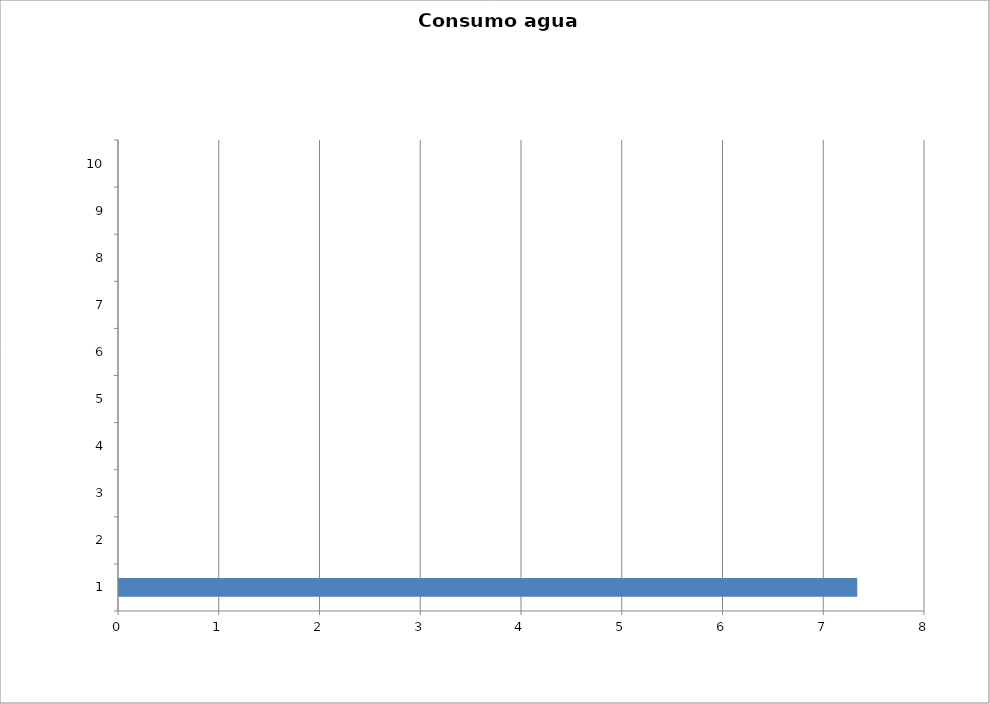
| Category | Series 0 |
|---|---|
| 0 | 7.328 |
| 1 | 0 |
| 2 | 0 |
| 3 | 0 |
| 4 | 0 |
| 5 | 0 |
| 6 | 0 |
| 7 | 0 |
| 8 | 0 |
| 9 | 0 |